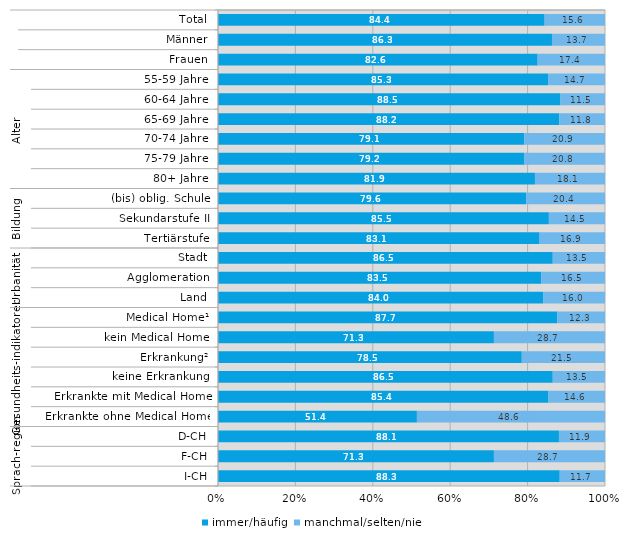
| Category | immer/häufig | manchmal/selten/nie |
|---|---|---|
| 0 | 84.4 | 15.6 |
| 1 | 86.3 | 13.7 |
| 2 | 82.6 | 17.4 |
| 3 | 85.3 | 14.7 |
| 4 | 88.5 | 11.5 |
| 5 | 88.2 | 11.8 |
| 6 | 79.1 | 20.9 |
| 7 | 79.2 | 20.8 |
| 8 | 81.9 | 18.1 |
| 9 | 79.6 | 20.4 |
| 10 | 85.5 | 14.5 |
| 11 | 83.1 | 16.9 |
| 12 | 86.5 | 13.5 |
| 13 | 83.5 | 16.5 |
| 14 | 84 | 16 |
| 15 | 87.7 | 12.3 |
| 16 | 71.3 | 28.7 |
| 17 | 78.5 | 21.5 |
| 18 | 86.5 | 13.5 |
| 19 | 85.4 | 14.6 |
| 20 | 51.4 | 48.6 |
| 21 | 88.1 | 11.9 |
| 22 | 71.3 | 28.7 |
| 23 | 88.3 | 11.7 |